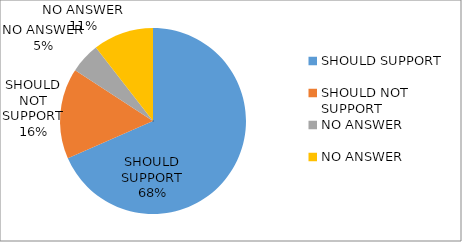
| Category | Series 0 |
|---|---|
| SHOULD SUPPORT | 0.684 |
| SHOULD NOT SUPPORT | 0.158 |
| NO ANSWER | 0.053 |
| NO ANSWER | 0.105 |